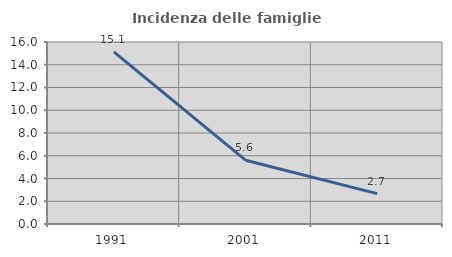
| Category | Incidenza delle famiglie numerose |
|---|---|
| 1991.0 | 15.129 |
| 2001.0 | 5.609 |
| 2011.0 | 2.67 |